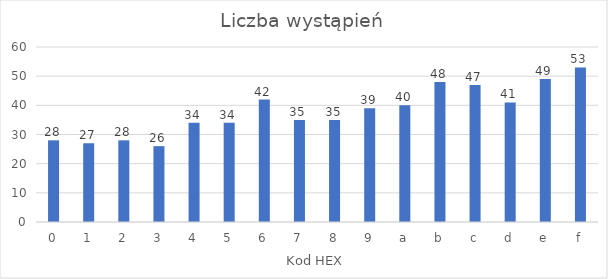
| Category | Liczba wystąpień |
|---|---|
| 0 | 28 |
| 1 | 27 |
| 2 | 28 |
| 3 | 26 |
| 4 | 34 |
| 5 | 34 |
| 6 | 42 |
| 7 | 35 |
| 8 | 35 |
| 9 | 39 |
| a | 40 |
| b | 48 |
| c | 47 |
| d | 41 |
| e | 49 |
| f | 53 |